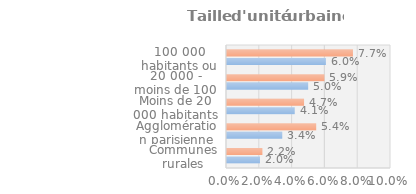
| Category | Series 0 | Series 1 |
|---|---|---|
| Communes rurales | 0.02 | 0.022 |
| Agglomération parisienne | 0.034 | 0.054 |
| Moins de 20 000 habitants | 0.041 | 0.047 |
| 20 000 - moins de 100 000 habitants | 0.05 | 0.059 |
| 100 000 habitants ou plus | 0.06 | 0.077 |